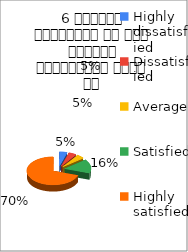
| Category | 6 शिक्षक समयनिष्ट है एवं नियमित व्याख्यान देते है  |
|---|---|
| Highly dissatisfied | 3 |
| Dissatisfied | 3 |
| Average | 3 |
| Satisfied | 10 |
| Highly satisfied | 44 |